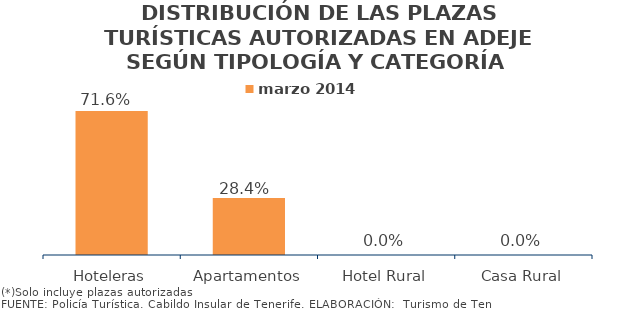
| Category | marzo 2014 |
|---|---|
| Hoteleras | 0.716 |
| Apartamentos | 0.284 |
| Hotel Rural | 0 |
| Casa Rural | 0 |